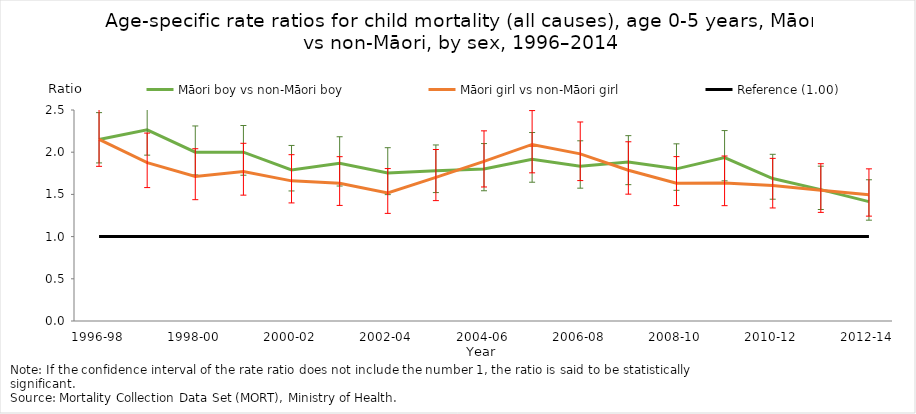
| Category | Māori boy vs non-Māori boy | Māori girl vs non-Māori girl | Reference (1.00) |
|---|---|---|---|
| 1996-98 | 2.15 | 2.152 | 1 |
| 1997-99 | 2.265 | 1.876 | 1 |
| 1998-00 | 2 | 1.713 | 1 |
| 1999-01 | 2 | 1.772 | 1 |
| 2000-02 | 1.79 | 1.66 | 1 |
| 2001-03 | 1.868 | 1.633 | 1 |
| 2002-04 | 1.753 | 1.518 | 1 |
| 2003-05 | 1.781 | 1.702 | 1 |
| 2004-06 | 1.801 | 1.891 | 1 |
| 2005-07 | 1.916 | 2.092 | 1 |
| 2006-08 | 1.833 | 1.981 | 1 |
| 2007-09 | 1.884 | 1.786 | 1 |
| 2008-10 | 1.803 | 1.632 | 1 |
| 2009-11 | 1.936 | 1.634 | 1 |
| 2010-12 | 1.688 | 1.607 | 1 |
| 2011-13 | 1.557 | 1.549 | 1 |
| 2012-14 | 1.414 | 1.497 | 1 |